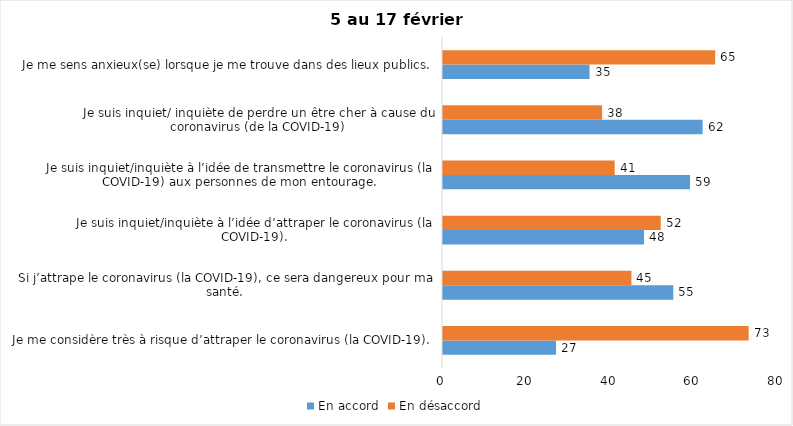
| Category | En accord | En désaccord |
|---|---|---|
| Je me considère très à risque d’attraper le coronavirus (la COVID-19). | 27 | 73 |
| Si j’attrape le coronavirus (la COVID-19), ce sera dangereux pour ma santé. | 55 | 45 |
| Je suis inquiet/inquiète à l’idée d’attraper le coronavirus (la COVID-19). | 48 | 52 |
| Je suis inquiet/inquiète à l’idée de transmettre le coronavirus (la COVID-19) aux personnes de mon entourage. | 59 | 41 |
| Je suis inquiet/ inquiète de perdre un être cher à cause du coronavirus (de la COVID-19) | 62 | 38 |
| Je me sens anxieux(se) lorsque je me trouve dans des lieux publics. | 35 | 65 |